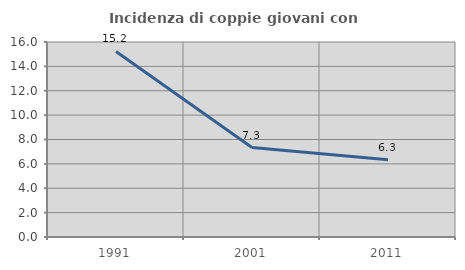
| Category | Incidenza di coppie giovani con figli |
|---|---|
| 1991.0 | 15.225 |
| 2001.0 | 7.343 |
| 2011.0 | 6.336 |